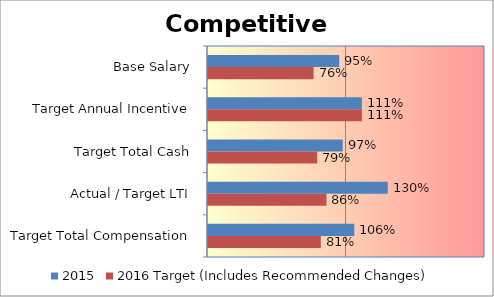
| Category | 2015 | 2016 Target (Includes Recommended Changes) |
|---|---|---|
| Base Salary | 0.947 | 0.762 |
| Target Annual Incentive | 1.111 | 1.111 |
| Target Total Cash | 0.972 | 0.789 |
| Actual / Target LTI | 1.298 | 0.855 |
| Target Total Compensation | 1.056 | 0.814 |